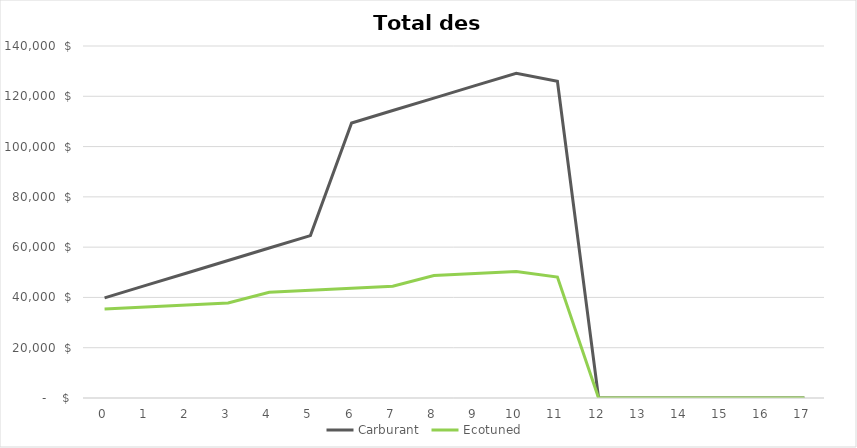
| Category | Carburant | Ecotuned |
|---|---|---|
| 0.0 | 39840 | 35396.1 |
| 1.0 | 44790 | 36188.3 |
| 2.0 | 49740 | 36980.5 |
| 3.0 | 54690 | 37772.7 |
| 4.0 | 59640 | 42064.9 |
| 5.0 | 64590 | 42857.1 |
| 6.0 | 109380 | 43649.3 |
| 7.0 | 114330 | 44441.5 |
| 8.0 | 119280 | 48733.7 |
| 9.0 | 124230 | 49525.9 |
| 10.0 | 129180 | 50318.1 |
| 11.0 | 125970 | 48110.3 |
| 12.0 | 0 | 0 |
| 13.0 | 0 | 0 |
| 14.0 | 0 | 0 |
| 15.0 | 0 | 0 |
| 16.0 | 0 | 0 |
| 17.0 | 0 | 0 |